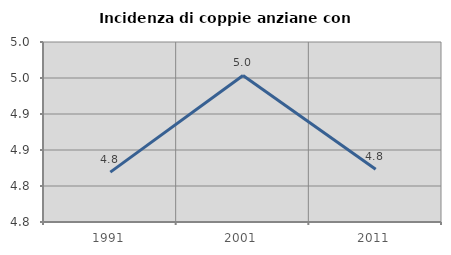
| Category | Incidenza di coppie anziane con figli |
|---|---|
| 1991.0 | 4.819 |
| 2001.0 | 4.954 |
| 2011.0 | 4.823 |